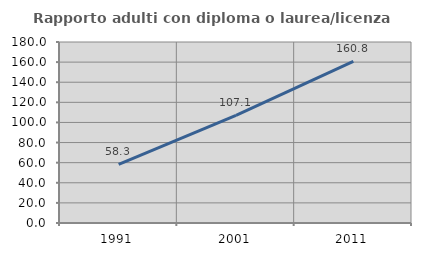
| Category | Rapporto adulti con diploma o laurea/licenza media  |
|---|---|
| 1991.0 | 58.284 |
| 2001.0 | 107.09 |
| 2011.0 | 160.759 |